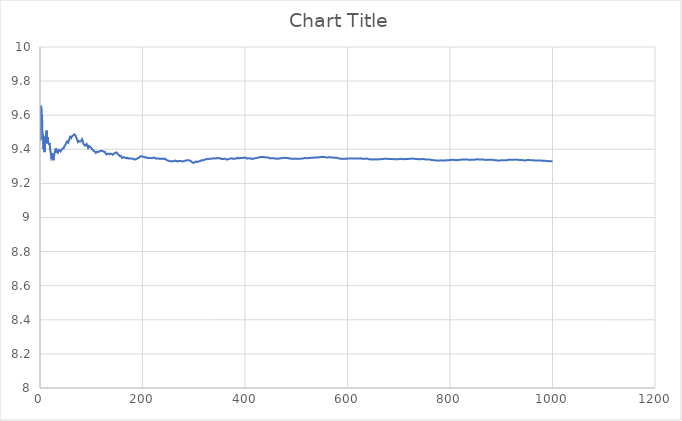
| Category | Series 0 |
|---|---|
| 1.0 | 9.45 |
| 2.0 | 9.655 |
| 3.0 | 9.619 |
| 4.0 | 9.592 |
| 5.0 | 9.461 |
| 6.0 | 9.487 |
| 7.0 | 9.402 |
| 8.0 | 9.473 |
| 9.0 | 9.383 |
| 10.0 | 9.43 |
| 11.0 | 9.463 |
| 12.0 | 9.497 |
| 13.0 | 9.51 |
| 14.0 | 9.436 |
| 15.0 | 9.471 |
| 16.0 | 9.44 |
| 17.0 | 9.431 |
| 18.0 | 9.434 |
| 19.0 | 9.432 |
| 20.0 | 9.393 |
| 21.0 | 9.383 |
| 22.0 | 9.349 |
| 23.0 | 9.355 |
| 24.0 | 9.377 |
| 25.0 | 9.356 |
| 26.0 | 9.336 |
| 27.0 | 9.355 |
| 28.0 | 9.369 |
| 29.0 | 9.386 |
| 30.0 | 9.391 |
| 31.0 | 9.406 |
| 32.0 | 9.379 |
| 33.0 | 9.388 |
| 34.0 | 9.386 |
| 35.0 | 9.381 |
| 36.0 | 9.397 |
| 37.0 | 9.401 |
| 38.0 | 9.394 |
| 39.0 | 9.392 |
| 40.0 | 9.388 |
| 41.0 | 9.39 |
| 42.0 | 9.397 |
| 43.0 | 9.401 |
| 44.0 | 9.405 |
| 45.0 | 9.4 |
| 46.0 | 9.404 |
| 47.0 | 9.412 |
| 48.0 | 9.421 |
| 49.0 | 9.421 |
| 50.0 | 9.429 |
| 51.0 | 9.436 |
| 52.0 | 9.437 |
| 53.0 | 9.446 |
| 54.0 | 9.441 |
| 55.0 | 9.439 |
| 56.0 | 9.447 |
| 57.0 | 9.456 |
| 58.0 | 9.466 |
| 59.0 | 9.474 |
| 60.0 | 9.474 |
| 61.0 | 9.467 |
| 62.0 | 9.475 |
| 63.0 | 9.475 |
| 64.0 | 9.479 |
| 65.0 | 9.479 |
| 66.0 | 9.487 |
| 67.0 | 9.489 |
| 68.0 | 9.486 |
| 69.0 | 9.49 |
| 70.0 | 9.475 |
| 71.0 | 9.473 |
| 72.0 | 9.46 |
| 73.0 | 9.459 |
| 74.0 | 9.443 |
| 75.0 | 9.448 |
| 76.0 | 9.448 |
| 77.0 | 9.451 |
| 78.0 | 9.445 |
| 79.0 | 9.448 |
| 80.0 | 9.448 |
| 81.0 | 9.453 |
| 82.0 | 9.459 |
| 83.0 | 9.455 |
| 84.0 | 9.443 |
| 85.0 | 9.431 |
| 86.0 | 9.431 |
| 87.0 | 9.424 |
| 88.0 | 9.43 |
| 89.0 | 9.422 |
| 90.0 | 9.427 |
| 91.0 | 9.431 |
| 92.0 | 9.43 |
| 93.0 | 9.418 |
| 94.0 | 9.408 |
| 95.0 | 9.414 |
| 96.0 | 9.419 |
| 97.0 | 9.416 |
| 98.0 | 9.414 |
| 99.0 | 9.416 |
| 100.0 | 9.408 |
| 101.0 | 9.406 |
| 102.0 | 9.399 |
| 103.0 | 9.399 |
| 104.0 | 9.395 |
| 105.0 | 9.389 |
| 106.0 | 9.384 |
| 107.0 | 9.387 |
| 108.0 | 9.387 |
| 109.0 | 9.379 |
| 110.0 | 9.383 |
| 111.0 | 9.386 |
| 112.0 | 9.383 |
| 113.0 | 9.385 |
| 114.0 | 9.385 |
| 115.0 | 9.385 |
| 116.0 | 9.386 |
| 117.0 | 9.391 |
| 118.0 | 9.39 |
| 119.0 | 9.391 |
| 120.0 | 9.394 |
| 121.0 | 9.391 |
| 122.0 | 9.394 |
| 123.0 | 9.388 |
| 124.0 | 9.387 |
| 125.0 | 9.386 |
| 126.0 | 9.388 |
| 127.0 | 9.383 |
| 128.0 | 9.375 |
| 129.0 | 9.372 |
| 130.0 | 9.37 |
| 131.0 | 9.373 |
| 132.0 | 9.373 |
| 133.0 | 9.374 |
| 134.0 | 9.374 |
| 135.0 | 9.377 |
| 136.0 | 9.371 |
| 137.0 | 9.375 |
| 138.0 | 9.374 |
| 139.0 | 9.373 |
| 140.0 | 9.374 |
| 141.0 | 9.371 |
| 142.0 | 9.368 |
| 143.0 | 9.371 |
| 144.0 | 9.372 |
| 145.0 | 9.376 |
| 146.0 | 9.378 |
| 147.0 | 9.379 |
| 148.0 | 9.381 |
| 149.0 | 9.378 |
| 150.0 | 9.381 |
| 151.0 | 9.377 |
| 152.0 | 9.372 |
| 153.0 | 9.371 |
| 154.0 | 9.366 |
| 155.0 | 9.364 |
| 156.0 | 9.36 |
| 157.0 | 9.359 |
| 158.0 | 9.361 |
| 159.0 | 9.355 |
| 160.0 | 9.349 |
| 161.0 | 9.351 |
| 162.0 | 9.351 |
| 163.0 | 9.353 |
| 164.0 | 9.354 |
| 165.0 | 9.354 |
| 166.0 | 9.351 |
| 167.0 | 9.35 |
| 168.0 | 9.347 |
| 169.0 | 9.348 |
| 170.0 | 9.351 |
| 171.0 | 9.353 |
| 172.0 | 9.346 |
| 173.0 | 9.346 |
| 174.0 | 9.347 |
| 175.0 | 9.344 |
| 176.0 | 9.346 |
| 177.0 | 9.346 |
| 178.0 | 9.346 |
| 179.0 | 9.345 |
| 180.0 | 9.346 |
| 181.0 | 9.342 |
| 182.0 | 9.343 |
| 183.0 | 9.342 |
| 184.0 | 9.34 |
| 185.0 | 9.342 |
| 186.0 | 9.342 |
| 187.0 | 9.341 |
| 188.0 | 9.342 |
| 189.0 | 9.344 |
| 190.0 | 9.346 |
| 191.0 | 9.347 |
| 192.0 | 9.35 |
| 193.0 | 9.352 |
| 194.0 | 9.353 |
| 195.0 | 9.356 |
| 196.0 | 9.359 |
| 197.0 | 9.36 |
| 198.0 | 9.359 |
| 199.0 | 9.354 |
| 200.0 | 9.357 |
| 201.0 | 9.353 |
| 202.0 | 9.356 |
| 203.0 | 9.353 |
| 204.0 | 9.353 |
| 205.0 | 9.352 |
| 206.0 | 9.355 |
| 207.0 | 9.351 |
| 208.0 | 9.352 |
| 209.0 | 9.349 |
| 210.0 | 9.35 |
| 211.0 | 9.35 |
| 212.0 | 9.35 |
| 213.0 | 9.349 |
| 214.0 | 9.349 |
| 215.0 | 9.347 |
| 216.0 | 9.348 |
| 217.0 | 9.35 |
| 218.0 | 9.348 |
| 219.0 | 9.348 |
| 220.0 | 9.35 |
| 221.0 | 9.348 |
| 222.0 | 9.351 |
| 223.0 | 9.351 |
| 224.0 | 9.351 |
| 225.0 | 9.347 |
| 226.0 | 9.345 |
| 227.0 | 9.347 |
| 228.0 | 9.346 |
| 229.0 | 9.346 |
| 230.0 | 9.345 |
| 231.0 | 9.345 |
| 232.0 | 9.346 |
| 233.0 | 9.342 |
| 234.0 | 9.343 |
| 235.0 | 9.345 |
| 236.0 | 9.345 |
| 237.0 | 9.347 |
| 238.0 | 9.345 |
| 239.0 | 9.346 |
| 240.0 | 9.343 |
| 241.0 | 9.343 |
| 242.0 | 9.344 |
| 243.0 | 9.346 |
| 244.0 | 9.346 |
| 245.0 | 9.342 |
| 246.0 | 9.339 |
| 247.0 | 9.338 |
| 248.0 | 9.335 |
| 249.0 | 9.333 |
| 250.0 | 9.334 |
| 251.0 | 9.329 |
| 252.0 | 9.332 |
| 253.0 | 9.333 |
| 254.0 | 9.33 |
| 255.0 | 9.332 |
| 256.0 | 9.33 |
| 257.0 | 9.328 |
| 258.0 | 9.329 |
| 259.0 | 9.329 |
| 260.0 | 9.331 |
| 261.0 | 9.332 |
| 262.0 | 9.331 |
| 263.0 | 9.333 |
| 264.0 | 9.334 |
| 265.0 | 9.332 |
| 266.0 | 9.332 |
| 267.0 | 9.331 |
| 268.0 | 9.328 |
| 269.0 | 9.33 |
| 270.0 | 9.332 |
| 271.0 | 9.332 |
| 272.0 | 9.331 |
| 273.0 | 9.333 |
| 274.0 | 9.332 |
| 275.0 | 9.333 |
| 276.0 | 9.33 |
| 277.0 | 9.327 |
| 278.0 | 9.329 |
| 279.0 | 9.33 |
| 280.0 | 9.33 |
| 281.0 | 9.33 |
| 282.0 | 9.332 |
| 283.0 | 9.332 |
| 284.0 | 9.332 |
| 285.0 | 9.334 |
| 286.0 | 9.336 |
| 287.0 | 9.335 |
| 288.0 | 9.335 |
| 289.0 | 9.337 |
| 290.0 | 9.336 |
| 291.0 | 9.335 |
| 292.0 | 9.335 |
| 293.0 | 9.332 |
| 294.0 | 9.331 |
| 295.0 | 9.329 |
| 296.0 | 9.326 |
| 297.0 | 9.326 |
| 298.0 | 9.322 |
| 299.0 | 9.319 |
| 300.0 | 9.32 |
| 301.0 | 9.322 |
| 302.0 | 9.324 |
| 303.0 | 9.326 |
| 304.0 | 9.328 |
| 305.0 | 9.327 |
| 306.0 | 9.325 |
| 307.0 | 9.326 |
| 308.0 | 9.327 |
| 309.0 | 9.328 |
| 310.0 | 9.33 |
| 311.0 | 9.329 |
| 312.0 | 9.33 |
| 313.0 | 9.332 |
| 314.0 | 9.333 |
| 315.0 | 9.335 |
| 316.0 | 9.336 |
| 317.0 | 9.336 |
| 318.0 | 9.335 |
| 319.0 | 9.336 |
| 320.0 | 9.337 |
| 321.0 | 9.339 |
| 322.0 | 9.34 |
| 323.0 | 9.341 |
| 324.0 | 9.342 |
| 325.0 | 9.343 |
| 326.0 | 9.343 |
| 327.0 | 9.343 |
| 328.0 | 9.342 |
| 329.0 | 9.342 |
| 330.0 | 9.344 |
| 331.0 | 9.346 |
| 332.0 | 9.345 |
| 333.0 | 9.346 |
| 334.0 | 9.344 |
| 335.0 | 9.344 |
| 336.0 | 9.346 |
| 337.0 | 9.347 |
| 338.0 | 9.346 |
| 339.0 | 9.347 |
| 340.0 | 9.348 |
| 341.0 | 9.348 |
| 342.0 | 9.346 |
| 343.0 | 9.347 |
| 344.0 | 9.347 |
| 345.0 | 9.348 |
| 346.0 | 9.349 |
| 347.0 | 9.348 |
| 348.0 | 9.348 |
| 349.0 | 9.347 |
| 350.0 | 9.346 |
| 351.0 | 9.348 |
| 352.0 | 9.348 |
| 353.0 | 9.345 |
| 354.0 | 9.343 |
| 355.0 | 9.345 |
| 356.0 | 9.344 |
| 357.0 | 9.344 |
| 358.0 | 9.343 |
| 359.0 | 9.344 |
| 360.0 | 9.345 |
| 361.0 | 9.344 |
| 362.0 | 9.344 |
| 363.0 | 9.343 |
| 364.0 | 9.34 |
| 365.0 | 9.341 |
| 366.0 | 9.341 |
| 367.0 | 9.341 |
| 368.0 | 9.343 |
| 369.0 | 9.344 |
| 370.0 | 9.345 |
| 371.0 | 9.347 |
| 372.0 | 9.346 |
| 373.0 | 9.347 |
| 374.0 | 9.347 |
| 375.0 | 9.346 |
| 376.0 | 9.345 |
| 377.0 | 9.345 |
| 378.0 | 9.344 |
| 379.0 | 9.345 |
| 380.0 | 9.346 |
| 381.0 | 9.344 |
| 382.0 | 9.345 |
| 383.0 | 9.346 |
| 384.0 | 9.347 |
| 385.0 | 9.349 |
| 386.0 | 9.35 |
| 387.0 | 9.349 |
| 388.0 | 9.347 |
| 389.0 | 9.348 |
| 390.0 | 9.349 |
| 391.0 | 9.35 |
| 392.0 | 9.349 |
| 393.0 | 9.35 |
| 394.0 | 9.349 |
| 395.0 | 9.348 |
| 396.0 | 9.35 |
| 397.0 | 9.351 |
| 398.0 | 9.351 |
| 399.0 | 9.352 |
| 400.0 | 9.351 |
| 401.0 | 9.35 |
| 402.0 | 9.349 |
| 403.0 | 9.346 |
| 404.0 | 9.346 |
| 405.0 | 9.346 |
| 406.0 | 9.347 |
| 407.0 | 9.349 |
| 408.0 | 9.347 |
| 409.0 | 9.347 |
| 410.0 | 9.347 |
| 411.0 | 9.346 |
| 412.0 | 9.346 |
| 413.0 | 9.344 |
| 414.0 | 9.343 |
| 415.0 | 9.344 |
| 416.0 | 9.345 |
| 417.0 | 9.346 |
| 418.0 | 9.347 |
| 419.0 | 9.348 |
| 420.0 | 9.348 |
| 421.0 | 9.348 |
| 422.0 | 9.349 |
| 423.0 | 9.349 |
| 424.0 | 9.35 |
| 425.0 | 9.35 |
| 426.0 | 9.351 |
| 427.0 | 9.352 |
| 428.0 | 9.352 |
| 429.0 | 9.354 |
| 430.0 | 9.355 |
| 431.0 | 9.355 |
| 432.0 | 9.354 |
| 433.0 | 9.353 |
| 434.0 | 9.354 |
| 435.0 | 9.355 |
| 436.0 | 9.355 |
| 437.0 | 9.356 |
| 438.0 | 9.354 |
| 439.0 | 9.353 |
| 440.0 | 9.352 |
| 441.0 | 9.352 |
| 442.0 | 9.353 |
| 443.0 | 9.353 |
| 444.0 | 9.353 |
| 445.0 | 9.35 |
| 446.0 | 9.35 |
| 447.0 | 9.349 |
| 448.0 | 9.347 |
| 449.0 | 9.348 |
| 450.0 | 9.348 |
| 451.0 | 9.347 |
| 452.0 | 9.348 |
| 453.0 | 9.346 |
| 454.0 | 9.347 |
| 455.0 | 9.349 |
| 456.0 | 9.348 |
| 457.0 | 9.348 |
| 458.0 | 9.346 |
| 459.0 | 9.345 |
| 460.0 | 9.344 |
| 461.0 | 9.345 |
| 462.0 | 9.346 |
| 463.0 | 9.346 |
| 464.0 | 9.345 |
| 465.0 | 9.345 |
| 466.0 | 9.345 |
| 467.0 | 9.345 |
| 468.0 | 9.347 |
| 469.0 | 9.348 |
| 470.0 | 9.348 |
| 471.0 | 9.347 |
| 472.0 | 9.347 |
| 473.0 | 9.348 |
| 474.0 | 9.349 |
| 475.0 | 9.35 |
| 476.0 | 9.35 |
| 477.0 | 9.349 |
| 478.0 | 9.35 |
| 479.0 | 9.348 |
| 480.0 | 9.349 |
| 481.0 | 9.35 |
| 482.0 | 9.349 |
| 483.0 | 9.349 |
| 484.0 | 9.349 |
| 485.0 | 9.347 |
| 486.0 | 9.347 |
| 487.0 | 9.347 |
| 488.0 | 9.346 |
| 489.0 | 9.346 |
| 490.0 | 9.345 |
| 491.0 | 9.345 |
| 492.0 | 9.344 |
| 493.0 | 9.344 |
| 494.0 | 9.344 |
| 495.0 | 9.345 |
| 496.0 | 9.344 |
| 497.0 | 9.345 |
| 498.0 | 9.345 |
| 499.0 | 9.344 |
| 500.0 | 9.345 |
| 501.0 | 9.343 |
| 502.0 | 9.344 |
| 503.0 | 9.343 |
| 504.0 | 9.344 |
| 505.0 | 9.344 |
| 506.0 | 9.344 |
| 507.0 | 9.344 |
| 508.0 | 9.345 |
| 509.0 | 9.346 |
| 510.0 | 9.346 |
| 511.0 | 9.345 |
| 512.0 | 9.345 |
| 513.0 | 9.346 |
| 514.0 | 9.347 |
| 515.0 | 9.348 |
| 516.0 | 9.349 |
| 517.0 | 9.35 |
| 518.0 | 9.349 |
| 519.0 | 9.348 |
| 520.0 | 9.347 |
| 521.0 | 9.346 |
| 522.0 | 9.347 |
| 523.0 | 9.348 |
| 524.0 | 9.35 |
| 525.0 | 9.351 |
| 526.0 | 9.35 |
| 527.0 | 9.349 |
| 528.0 | 9.35 |
| 529.0 | 9.351 |
| 530.0 | 9.351 |
| 531.0 | 9.352 |
| 532.0 | 9.35 |
| 533.0 | 9.351 |
| 534.0 | 9.351 |
| 535.0 | 9.351 |
| 536.0 | 9.352 |
| 537.0 | 9.353 |
| 538.0 | 9.352 |
| 539.0 | 9.352 |
| 540.0 | 9.351 |
| 541.0 | 9.351 |
| 542.0 | 9.352 |
| 543.0 | 9.353 |
| 544.0 | 9.353 |
| 545.0 | 9.353 |
| 546.0 | 9.354 |
| 547.0 | 9.356 |
| 548.0 | 9.355 |
| 549.0 | 9.354 |
| 550.0 | 9.354 |
| 551.0 | 9.354 |
| 552.0 | 9.355 |
| 553.0 | 9.355 |
| 554.0 | 9.356 |
| 555.0 | 9.356 |
| 556.0 | 9.355 |
| 557.0 | 9.354 |
| 558.0 | 9.353 |
| 559.0 | 9.352 |
| 560.0 | 9.352 |
| 561.0 | 9.352 |
| 562.0 | 9.352 |
| 563.0 | 9.353 |
| 564.0 | 9.354 |
| 565.0 | 9.355 |
| 566.0 | 9.354 |
| 567.0 | 9.353 |
| 568.0 | 9.352 |
| 569.0 | 9.352 |
| 570.0 | 9.352 |
| 571.0 | 9.352 |
| 572.0 | 9.352 |
| 573.0 | 9.351 |
| 574.0 | 9.351 |
| 575.0 | 9.349 |
| 576.0 | 9.35 |
| 577.0 | 9.35 |
| 578.0 | 9.35 |
| 579.0 | 9.35 |
| 580.0 | 9.35 |
| 581.0 | 9.349 |
| 582.0 | 9.348 |
| 583.0 | 9.347 |
| 584.0 | 9.346 |
| 585.0 | 9.345 |
| 586.0 | 9.345 |
| 587.0 | 9.346 |
| 588.0 | 9.344 |
| 589.0 | 9.344 |
| 590.0 | 9.344 |
| 591.0 | 9.344 |
| 592.0 | 9.345 |
| 593.0 | 9.343 |
| 594.0 | 9.344 |
| 595.0 | 9.345 |
| 596.0 | 9.345 |
| 597.0 | 9.346 |
| 598.0 | 9.345 |
| 599.0 | 9.345 |
| 600.0 | 9.346 |
| 601.0 | 9.346 |
| 602.0 | 9.346 |
| 603.0 | 9.346 |
| 604.0 | 9.346 |
| 605.0 | 9.346 |
| 606.0 | 9.346 |
| 607.0 | 9.346 |
| 608.0 | 9.347 |
| 609.0 | 9.347 |
| 610.0 | 9.346 |
| 611.0 | 9.347 |
| 612.0 | 9.346 |
| 613.0 | 9.347 |
| 614.0 | 9.347 |
| 615.0 | 9.347 |
| 616.0 | 9.346 |
| 617.0 | 9.346 |
| 618.0 | 9.347 |
| 619.0 | 9.346 |
| 620.0 | 9.346 |
| 621.0 | 9.347 |
| 622.0 | 9.347 |
| 623.0 | 9.347 |
| 624.0 | 9.346 |
| 625.0 | 9.346 |
| 626.0 | 9.347 |
| 627.0 | 9.345 |
| 628.0 | 9.344 |
| 629.0 | 9.344 |
| 630.0 | 9.344 |
| 631.0 | 9.343 |
| 632.0 | 9.344 |
| 633.0 | 9.345 |
| 634.0 | 9.345 |
| 635.0 | 9.345 |
| 636.0 | 9.345 |
| 637.0 | 9.345 |
| 638.0 | 9.346 |
| 639.0 | 9.345 |
| 640.0 | 9.343 |
| 641.0 | 9.342 |
| 642.0 | 9.342 |
| 643.0 | 9.341 |
| 644.0 | 9.342 |
| 645.0 | 9.341 |
| 646.0 | 9.342 |
| 647.0 | 9.34 |
| 648.0 | 9.339 |
| 649.0 | 9.34 |
| 650.0 | 9.34 |
| 651.0 | 9.341 |
| 652.0 | 9.342 |
| 653.0 | 9.341 |
| 654.0 | 9.34 |
| 655.0 | 9.34 |
| 656.0 | 9.341 |
| 657.0 | 9.34 |
| 658.0 | 9.34 |
| 659.0 | 9.341 |
| 660.0 | 9.341 |
| 661.0 | 9.341 |
| 662.0 | 9.341 |
| 663.0 | 9.342 |
| 664.0 | 9.341 |
| 665.0 | 9.341 |
| 666.0 | 9.342 |
| 667.0 | 9.343 |
| 668.0 | 9.343 |
| 669.0 | 9.344 |
| 670.0 | 9.344 |
| 671.0 | 9.343 |
| 672.0 | 9.344 |
| 673.0 | 9.345 |
| 674.0 | 9.344 |
| 675.0 | 9.344 |
| 676.0 | 9.345 |
| 677.0 | 9.345 |
| 678.0 | 9.345 |
| 679.0 | 9.344 |
| 680.0 | 9.343 |
| 681.0 | 9.344 |
| 682.0 | 9.343 |
| 683.0 | 9.344 |
| 684.0 | 9.343 |
| 685.0 | 9.342 |
| 686.0 | 9.342 |
| 687.0 | 9.343 |
| 688.0 | 9.342 |
| 689.0 | 9.343 |
| 690.0 | 9.343 |
| 691.0 | 9.342 |
| 692.0 | 9.342 |
| 693.0 | 9.342 |
| 694.0 | 9.341 |
| 695.0 | 9.342 |
| 696.0 | 9.342 |
| 697.0 | 9.342 |
| 698.0 | 9.342 |
| 699.0 | 9.343 |
| 700.0 | 9.342 |
| 701.0 | 9.343 |
| 702.0 | 9.344 |
| 703.0 | 9.343 |
| 704.0 | 9.344 |
| 705.0 | 9.343 |
| 706.0 | 9.343 |
| 707.0 | 9.342 |
| 708.0 | 9.342 |
| 709.0 | 9.342 |
| 710.0 | 9.341 |
| 711.0 | 9.342 |
| 712.0 | 9.343 |
| 713.0 | 9.344 |
| 714.0 | 9.344 |
| 715.0 | 9.344 |
| 716.0 | 9.343 |
| 717.0 | 9.343 |
| 718.0 | 9.344 |
| 719.0 | 9.345 |
| 720.0 | 9.344 |
| 721.0 | 9.344 |
| 722.0 | 9.345 |
| 723.0 | 9.345 |
| 724.0 | 9.345 |
| 725.0 | 9.345 |
| 726.0 | 9.345 |
| 727.0 | 9.345 |
| 728.0 | 9.346 |
| 729.0 | 9.346 |
| 730.0 | 9.345 |
| 731.0 | 9.343 |
| 732.0 | 9.344 |
| 733.0 | 9.344 |
| 734.0 | 9.344 |
| 735.0 | 9.342 |
| 736.0 | 9.343 |
| 737.0 | 9.343 |
| 738.0 | 9.342 |
| 739.0 | 9.342 |
| 740.0 | 9.341 |
| 741.0 | 9.342 |
| 742.0 | 9.342 |
| 743.0 | 9.343 |
| 744.0 | 9.342 |
| 745.0 | 9.342 |
| 746.0 | 9.343 |
| 747.0 | 9.343 |
| 748.0 | 9.343 |
| 749.0 | 9.342 |
| 750.0 | 9.341 |
| 751.0 | 9.341 |
| 752.0 | 9.341 |
| 753.0 | 9.34 |
| 754.0 | 9.34 |
| 755.0 | 9.341 |
| 756.0 | 9.341 |
| 757.0 | 9.34 |
| 758.0 | 9.34 |
| 759.0 | 9.341 |
| 760.0 | 9.341 |
| 761.0 | 9.34 |
| 762.0 | 9.339 |
| 763.0 | 9.338 |
| 764.0 | 9.337 |
| 765.0 | 9.337 |
| 766.0 | 9.337 |
| 767.0 | 9.337 |
| 768.0 | 9.336 |
| 769.0 | 9.336 |
| 770.0 | 9.336 |
| 771.0 | 9.336 |
| 772.0 | 9.335 |
| 773.0 | 9.335 |
| 774.0 | 9.334 |
| 775.0 | 9.334 |
| 776.0 | 9.335 |
| 777.0 | 9.335 |
| 778.0 | 9.335 |
| 779.0 | 9.335 |
| 780.0 | 9.335 |
| 781.0 | 9.335 |
| 782.0 | 9.336 |
| 783.0 | 9.334 |
| 784.0 | 9.334 |
| 785.0 | 9.334 |
| 786.0 | 9.334 |
| 787.0 | 9.334 |
| 788.0 | 9.334 |
| 789.0 | 9.335 |
| 790.0 | 9.335 |
| 791.0 | 9.335 |
| 792.0 | 9.335 |
| 793.0 | 9.336 |
| 794.0 | 9.336 |
| 795.0 | 9.336 |
| 796.0 | 9.336 |
| 797.0 | 9.336 |
| 798.0 | 9.336 |
| 799.0 | 9.337 |
| 800.0 | 9.337 |
| 801.0 | 9.337 |
| 802.0 | 9.337 |
| 803.0 | 9.337 |
| 804.0 | 9.338 |
| 805.0 | 9.338 |
| 806.0 | 9.339 |
| 807.0 | 9.338 |
| 808.0 | 9.337 |
| 809.0 | 9.337 |
| 810.0 | 9.337 |
| 811.0 | 9.336 |
| 812.0 | 9.336 |
| 813.0 | 9.336 |
| 814.0 | 9.337 |
| 815.0 | 9.337 |
| 816.0 | 9.337 |
| 817.0 | 9.338 |
| 818.0 | 9.338 |
| 819.0 | 9.338 |
| 820.0 | 9.338 |
| 821.0 | 9.339 |
| 822.0 | 9.339 |
| 823.0 | 9.339 |
| 824.0 | 9.34 |
| 825.0 | 9.339 |
| 826.0 | 9.339 |
| 827.0 | 9.339 |
| 828.0 | 9.34 |
| 829.0 | 9.339 |
| 830.0 | 9.34 |
| 831.0 | 9.34 |
| 832.0 | 9.34 |
| 833.0 | 9.341 |
| 834.0 | 9.34 |
| 835.0 | 9.34 |
| 836.0 | 9.338 |
| 837.0 | 9.338 |
| 838.0 | 9.338 |
| 839.0 | 9.338 |
| 840.0 | 9.339 |
| 841.0 | 9.339 |
| 842.0 | 9.339 |
| 843.0 | 9.339 |
| 844.0 | 9.339 |
| 845.0 | 9.339 |
| 846.0 | 9.339 |
| 847.0 | 9.339 |
| 848.0 | 9.339 |
| 849.0 | 9.34 |
| 850.0 | 9.341 |
| 851.0 | 9.341 |
| 852.0 | 9.341 |
| 853.0 | 9.342 |
| 854.0 | 9.341 |
| 855.0 | 9.34 |
| 856.0 | 9.34 |
| 857.0 | 9.341 |
| 858.0 | 9.34 |
| 859.0 | 9.339 |
| 860.0 | 9.34 |
| 861.0 | 9.34 |
| 862.0 | 9.34 |
| 863.0 | 9.34 |
| 864.0 | 9.34 |
| 865.0 | 9.339 |
| 866.0 | 9.339 |
| 867.0 | 9.339 |
| 868.0 | 9.338 |
| 869.0 | 9.339 |
| 870.0 | 9.338 |
| 871.0 | 9.338 |
| 872.0 | 9.338 |
| 873.0 | 9.338 |
| 874.0 | 9.339 |
| 875.0 | 9.338 |
| 876.0 | 9.338 |
| 877.0 | 9.339 |
| 878.0 | 9.339 |
| 879.0 | 9.339 |
| 880.0 | 9.338 |
| 881.0 | 9.339 |
| 882.0 | 9.338 |
| 883.0 | 9.338 |
| 884.0 | 9.338 |
| 885.0 | 9.338 |
| 886.0 | 9.337 |
| 887.0 | 9.336 |
| 888.0 | 9.336 |
| 889.0 | 9.336 |
| 890.0 | 9.336 |
| 891.0 | 9.336 |
| 892.0 | 9.335 |
| 893.0 | 9.334 |
| 894.0 | 9.333 |
| 895.0 | 9.333 |
| 896.0 | 9.334 |
| 897.0 | 9.334 |
| 898.0 | 9.335 |
| 899.0 | 9.335 |
| 900.0 | 9.335 |
| 901.0 | 9.336 |
| 902.0 | 9.335 |
| 903.0 | 9.336 |
| 904.0 | 9.336 |
| 905.0 | 9.337 |
| 906.0 | 9.336 |
| 907.0 | 9.335 |
| 908.0 | 9.336 |
| 909.0 | 9.336 |
| 910.0 | 9.336 |
| 911.0 | 9.336 |
| 912.0 | 9.337 |
| 913.0 | 9.337 |
| 914.0 | 9.338 |
| 915.0 | 9.339 |
| 916.0 | 9.339 |
| 917.0 | 9.339 |
| 918.0 | 9.338 |
| 919.0 | 9.339 |
| 920.0 | 9.339 |
| 921.0 | 9.338 |
| 922.0 | 9.339 |
| 923.0 | 9.338 |
| 924.0 | 9.338 |
| 925.0 | 9.339 |
| 926.0 | 9.339 |
| 927.0 | 9.34 |
| 928.0 | 9.339 |
| 929.0 | 9.34 |
| 930.0 | 9.34 |
| 931.0 | 9.339 |
| 932.0 | 9.339 |
| 933.0 | 9.337 |
| 934.0 | 9.337 |
| 935.0 | 9.337 |
| 936.0 | 9.337 |
| 937.0 | 9.337 |
| 938.0 | 9.337 |
| 939.0 | 9.337 |
| 940.0 | 9.337 |
| 941.0 | 9.336 |
| 942.0 | 9.336 |
| 943.0 | 9.336 |
| 944.0 | 9.335 |
| 945.0 | 9.336 |
| 946.0 | 9.335 |
| 947.0 | 9.335 |
| 948.0 | 9.335 |
| 949.0 | 9.336 |
| 950.0 | 9.336 |
| 951.0 | 9.337 |
| 952.0 | 9.337 |
| 953.0 | 9.338 |
| 954.0 | 9.337 |
| 955.0 | 9.337 |
| 956.0 | 9.337 |
| 957.0 | 9.337 |
| 958.0 | 9.336 |
| 959.0 | 9.336 |
| 960.0 | 9.336 |
| 961.0 | 9.335 |
| 962.0 | 9.336 |
| 963.0 | 9.336 |
| 964.0 | 9.335 |
| 965.0 | 9.334 |
| 966.0 | 9.335 |
| 967.0 | 9.335 |
| 968.0 | 9.335 |
| 969.0 | 9.334 |
| 970.0 | 9.333 |
| 971.0 | 9.333 |
| 972.0 | 9.334 |
| 973.0 | 9.334 |
| 974.0 | 9.334 |
| 975.0 | 9.334 |
| 976.0 | 9.334 |
| 977.0 | 9.334 |
| 978.0 | 9.334 |
| 979.0 | 9.333 |
| 980.0 | 9.333 |
| 981.0 | 9.333 |
| 982.0 | 9.332 |
| 983.0 | 9.332 |
| 984.0 | 9.333 |
| 985.0 | 9.333 |
| 986.0 | 9.333 |
| 987.0 | 9.332 |
| 988.0 | 9.331 |
| 989.0 | 9.331 |
| 990.0 | 9.331 |
| 991.0 | 9.331 |
| 992.0 | 9.331 |
| 993.0 | 9.331 |
| 994.0 | 9.331 |
| 995.0 | 9.33 |
| 996.0 | 9.33 |
| 997.0 | 9.33 |
| 998.0 | 9.33 |
| 999.0 | 9.33 |
| 1000.0 | 9.33 |